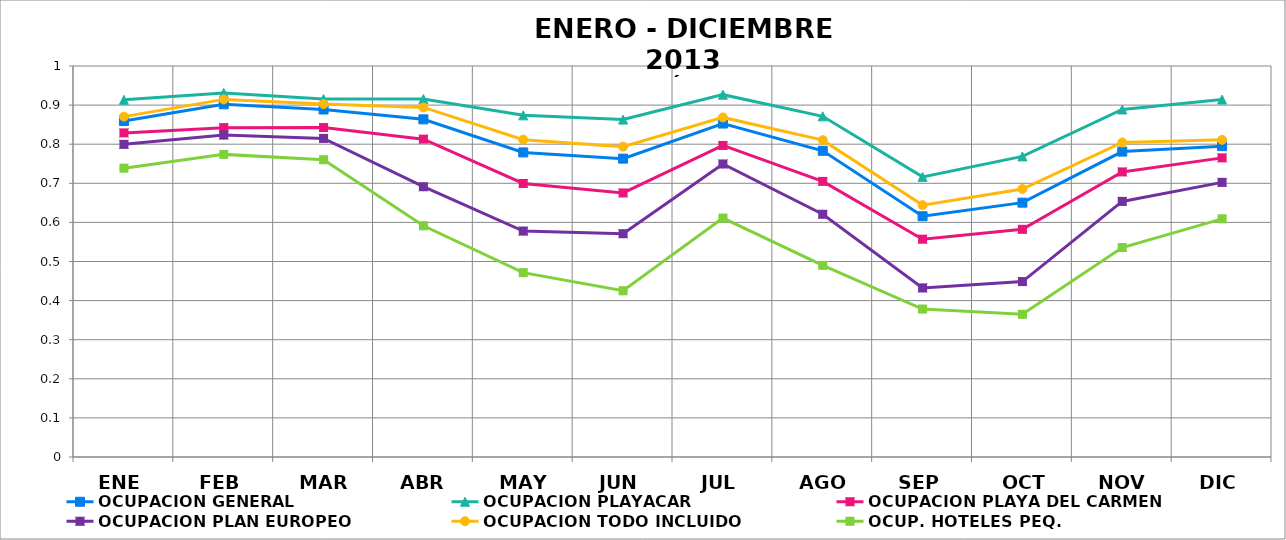
| Category | OCUPACION GENERAL | OCUPACION PLAYACAR | OCUPACION PLAYA DEL CARMEN | OCUPACION PLAN EUROPEO | OCUPACION TODO INCLUIDO | OCUP. HOTELES PEQ.  |
|---|---|---|---|---|---|---|
| ENE | 0.859 | 0.913 | 0.829 | 0.8 | 0.87 | 0.739 |
| FEB | 0.902 | 0.931 | 0.842 | 0.823 | 0.915 | 0.774 |
| MAR | 0.889 | 0.916 | 0.843 | 0.815 | 0.903 | 0.76 |
| ABR | 0.864 | 0.915 | 0.813 | 0.691 | 0.894 | 0.591 |
| MAY | 0.779 | 0.874 | 0.7 | 0.578 | 0.812 | 0.472 |
| JUN | 0.763 | 0.863 | 0.675 | 0.571 | 0.794 | 0.425 |
| JUL | 0.853 | 0.927 | 0.797 | 0.749 | 0.868 | 0.611 |
| AGO | 0.783 | 0.871 | 0.705 | 0.621 | 0.81 | 0.49 |
| SEP | 0.616 | 0.716 | 0.557 | 0.432 | 0.644 | 0.378 |
| OCT | 0.65 | 0.769 | 0.582 | 0.449 | 0.685 | 0.365 |
| NOV | 0.781 | 0.889 | 0.729 | 0.654 | 0.804 | 0.536 |
| DIC | 0.795 | 0.914 | 0.765 | 0.702 | 0.811 | 0.609 |